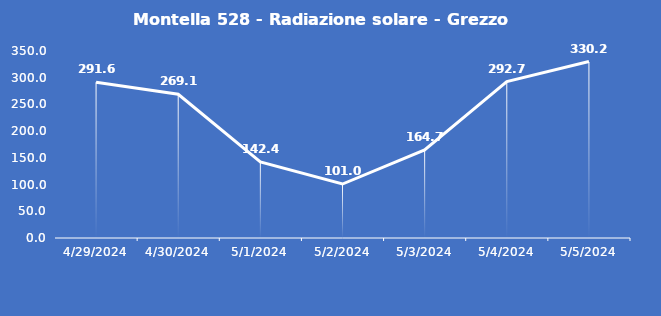
| Category | Montella 528 - Radiazione solare - Grezzo (W/m2) |
|---|---|
| 4/29/24 | 291.6 |
| 4/30/24 | 269.1 |
| 5/1/24 | 142.4 |
| 5/2/24 | 101 |
| 5/3/24 | 164.7 |
| 5/4/24 | 292.7 |
| 5/5/24 | 330.2 |